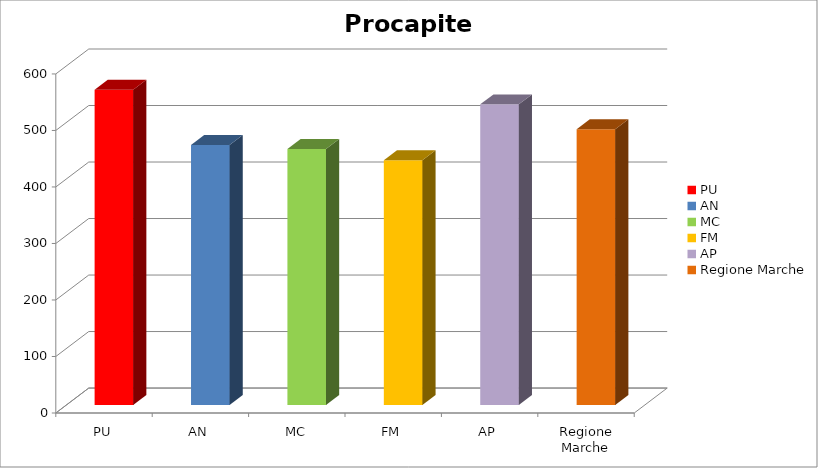
| Category | Procapite (kg/abitante*anno) |
|---|---|
| PU | 558 |
| AN | 460 |
| MC | 453 |
| FM | 433 |
| AP | 532 |
| Regione Marche | 488 |